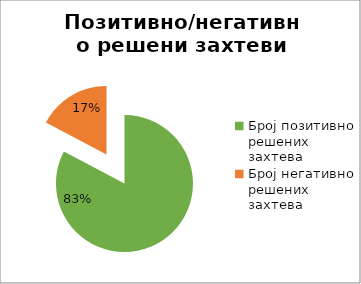
| Category | Series 0 |
|---|---|
| Број позитивно решених захтева | 54983 |
| Број негативно решених захтева | 11489 |